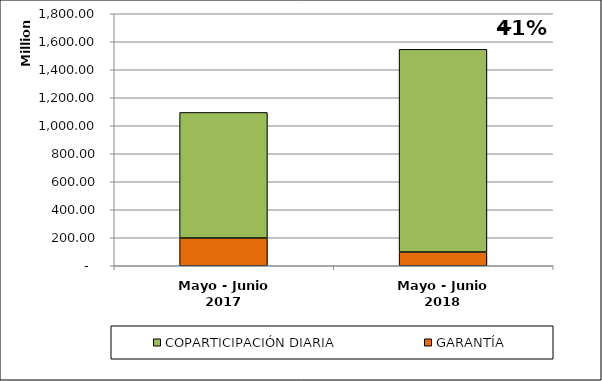
| Category | GARANTÍA | COPARTICIPACIÓN DIARIA |
|---|---|---|
| Mayo - Junio 2017 | 198083845.92 | 897026798.38 |
| Mayo - Junio 2018 | 98050755.82 | 1447850393.22 |